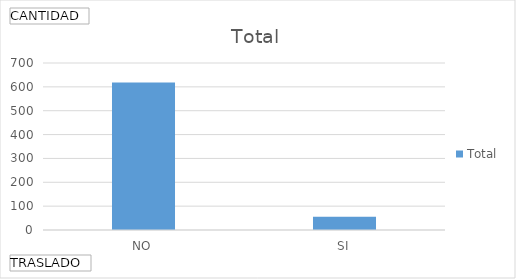
| Category | Total |
|---|---|
| NO | 618 |
| SI | 56 |